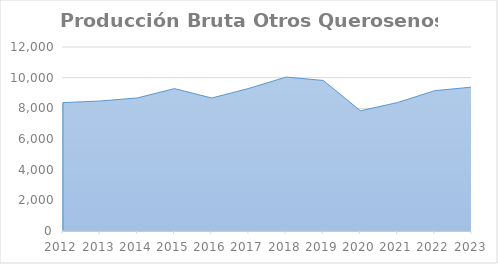
| Category | Otros Querosenos |
|---|---|
| 2012.0 | 8371.569 |
| 2013.0 | 8477.629 |
| 2014.0 | 8678.839 |
| 2015.0 | 9285.382 |
| 2016.0 | 8672.614 |
| 2017.0 | 9300.338 |
| 2018.0 | 10038.733 |
| 2019.0 | 9816.646 |
| 2020.0 | 7838.507 |
| 2021.0 | 8378.684 |
| 2022.0 | 9153.704 |
| 2023.0 | 9387.04 |